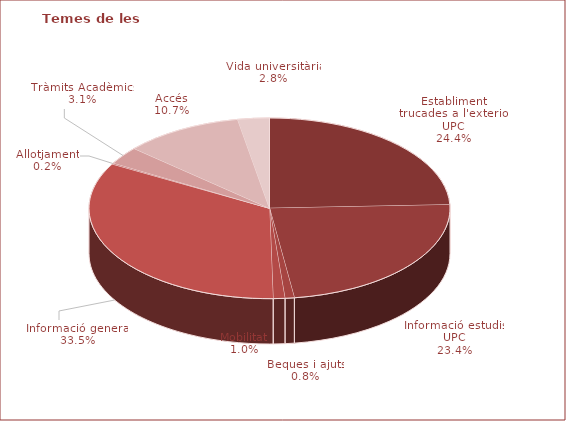
| Category | Series 0 |
|---|---|
| Establiment trucades a l'exterior UPC | 23.3 |
| Informació estudis UPC | 22.4 |
| Beques i ajuts | 0.8 |
| Mobilitat | 1 |
| Informació general | 32 |
| Allotjament | 0.2 |
| Tràmits Acadèmics | 3 |
| Accés | 10.2 |
| Vida universitària | 2.7 |